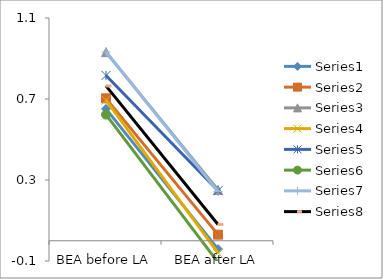
| Category | Series 0 | Series 1 | Series 2 | Series 3 | Series 4 | Series 5 | Series 6 | Series 7 |
|---|---|---|---|---|---|---|---|---|
| BEA before LA | 0.651 | 0.703 | 0.931 | 0.695 | 0.816 | 0.623 | 0.932 | 0.765 |
| BEA after LA | -0.041 | 0.03 | 0.251 | -0.06 | 0.247 | -0.107 | 0.243 | 0.081 |